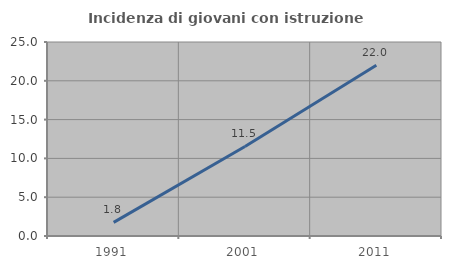
| Category | Incidenza di giovani con istruzione universitaria |
|---|---|
| 1991.0 | 1.754 |
| 2001.0 | 11.538 |
| 2011.0 | 22 |